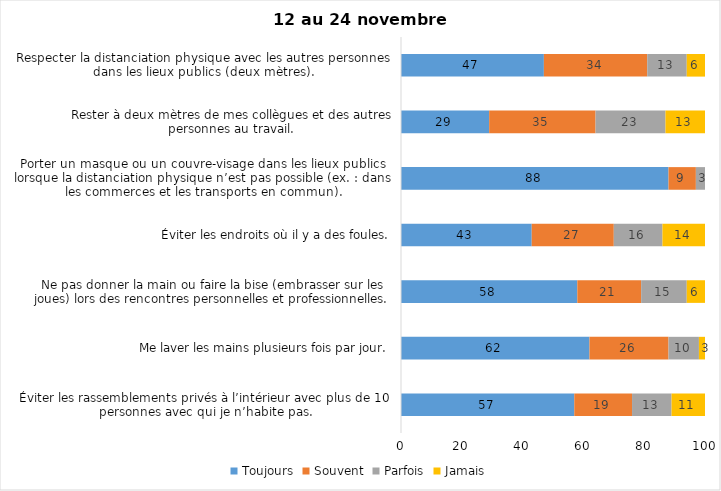
| Category | Toujours | Souvent | Parfois | Jamais |
|---|---|---|---|---|
| Éviter les rassemblements privés à l’intérieur avec plus de 10 personnes avec qui je n’habite pas. | 57 | 19 | 13 | 11 |
| Me laver les mains plusieurs fois par jour. | 62 | 26 | 10 | 3 |
| Ne pas donner la main ou faire la bise (embrasser sur les joues) lors des rencontres personnelles et professionnelles. | 58 | 21 | 15 | 6 |
| Éviter les endroits où il y a des foules. | 43 | 27 | 16 | 14 |
| Porter un masque ou un couvre-visage dans les lieux publics lorsque la distanciation physique n’est pas possible (ex. : dans les commerces et les transports en commun). | 88 | 9 | 3 | 0 |
| Rester à deux mètres de mes collègues et des autres personnes au travail. | 29 | 35 | 23 | 13 |
| Respecter la distanciation physique avec les autres personnes dans les lieux publics (deux mètres). | 47 | 34 | 13 | 6 |